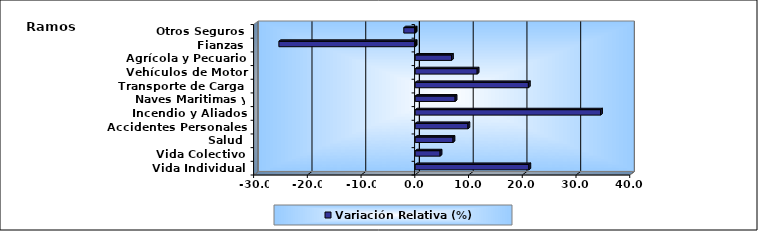
| Category | Variación Relativa (%) |
|---|---|
| Vida Individual | 21.151 |
| Vida Colectivo | 4.63 |
| Salud | 7.035 |
| Accidentes Personales | 9.815 |
| Incendio y Aliados | 34.495 |
| Naves Maritimas y Aéreas | 7.428 |
| Transporte de Carga | 21.063 |
| Vehículos de Motor | 11.532 |
| Agrícola y Pecuario | 6.753 |
| Fianzas | -25.373 |
| Otros Seguros | -2.125 |